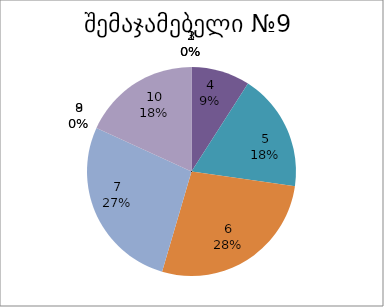
| Category | რაოდენობა | ქულა |
|---|---|---|
| 0 | 0 | 1 |
| 1 | 0 | 2 |
| 2 | 0 | 3 |
| 3 | 1 | 4 |
| 4 | 2 | 5 |
| 5 | 3 | 6 |
| 6 | 3 | 7 |
| 7 | 0 | 8 |
| 8 | 0 | 9 |
| 9 | 2 | 10 |